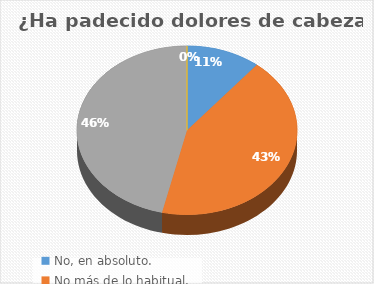
| Category | 5 |
|---|---|
| No, en absoluto. | 12 |
| No más de lo habitual. | 47 |
| Bastante más que lo habitual. | 51 |
| Mucho más que lo habitual | 0 |